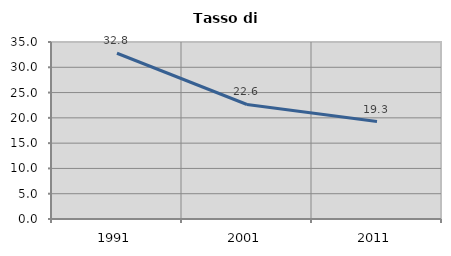
| Category | Tasso di disoccupazione   |
|---|---|
| 1991.0 | 32.777 |
| 2001.0 | 22.644 |
| 2011.0 | 19.271 |